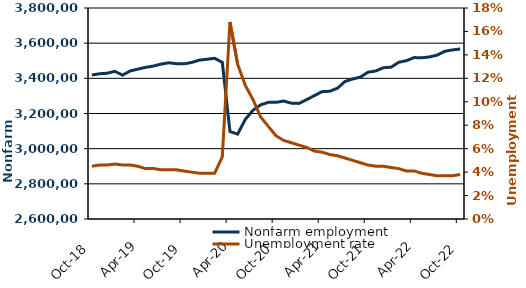
| Category |  Nonfarm employment  |
|---|---|
| 2018-10-01 | 3418900 |
| 2018-11-01 | 3425900 |
| 2018-12-01 | 3429100 |
| 2019-01-01 | 3439900 |
| 2019-02-01 | 3418200 |
| 2019-03-01 | 3442100 |
| 2019-04-01 | 3452400 |
| 2019-05-01 | 3462400 |
| 2019-06-01 | 3469500 |
| 2019-07-01 | 3480800 |
| 2019-08-01 | 3488400 |
| 2019-09-01 | 3483500 |
| 2019-10-01 | 3482300 |
| 2019-11-01 | 3490000 |
| 2019-12-01 | 3503700 |
| 2020-01-01 | 3508400 |
| 2020-02-01 | 3514000 |
| 2020-03-01 | 3490900 |
| 2020-04-01 | 3097600 |
| 2020-05-01 | 3082700 |
| 2020-06-01 | 3166600 |
| 2020-07-01 | 3218200 |
| 2020-08-01 | 3249200 |
| 2020-09-01 | 3263300 |
| 2020-10-01 | 3263300 |
| 2020-11-01 | 3271000 |
| 2020-12-01 | 3258600 |
| 2021-01-01 | 3257300 |
| 2021-02-01 | 3279000 |
| 2021-03-01 | 3301600 |
| 2021-04-01 | 3324200 |
| 2021-05-01 | 3326500 |
| 2021-06-01 | 3343600 |
| 2021-07-01 | 3382500 |
| 2021-08-01 | 3396100 |
| 2021-09-01 | 3407000 |
| 2021-10-01 | 3435100 |
| 2021-11-01 | 3441900 |
| 2021-12-01 | 3460400 |
| 2022-01-01 | 3463400 |
| 2022-02-01 | 3491400 |
| 2022-03-01 | 3500400 |
| 2022-04-01 | 3518000 |
| 2022-05-01 | 3516800 |
| 2022-06-01 | 3521800 |
| 2022-07-01 | 3532000 |
| 2022-08-01 | 3553700 |
| 2022-09-01 | 3561600 |
| 2022-10-01 | 3567000 |